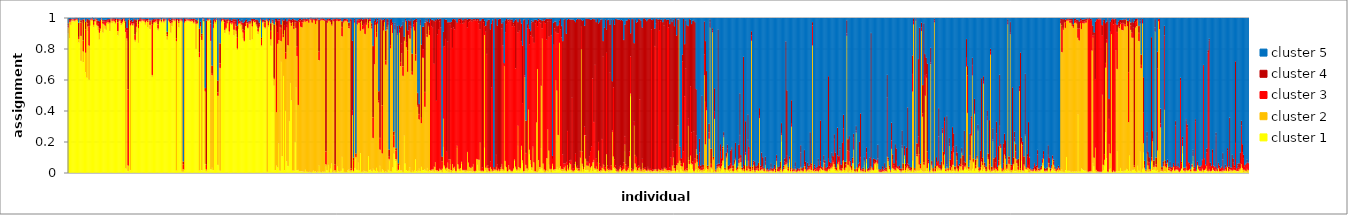
| Category | cluster 1 | cluster 2 | cluster 3 | cluster 4 | cluster 5 |
|---|---|---|---|---|---|
| 0 | 0.898 | 0.039 | 0.012 | 0.016 | 0.035 |
| 1 | 0.867 | 0.107 | 0.009 | 0.009 | 0.009 |
| 2 | 0.954 | 0.021 | 0.006 | 0.011 | 0.009 |
| 3 | 0.977 | 0.007 | 0.006 | 0.004 | 0.005 |
| 4 | 0.977 | 0.01 | 0.004 | 0.005 | 0.004 |
| 5 | 0.976 | 0.006 | 0.005 | 0.007 | 0.006 |
| 6 | 0.975 | 0.01 | 0.007 | 0.005 | 0.004 |
| 7 | 0.983 | 0.005 | 0.004 | 0.005 | 0.004 |
| 8 | 0.976 | 0.01 | 0.005 | 0.005 | 0.004 |
| 9 | 0.84 | 0.023 | 0.013 | 0.092 | 0.033 |
| 10 | 0.979 | 0.008 | 0.006 | 0.004 | 0.004 |
| 11 | 0.721 | 0.161 | 0.087 | 0.015 | 0.017 |
| 12 | 0.965 | 0.012 | 0.007 | 0.007 | 0.009 |
| 13 | 0.713 | 0.069 | 0.071 | 0.136 | 0.012 |
| 14 | 0.969 | 0.019 | 0.004 | 0.003 | 0.005 |
| 15 | 0.648 | 0.127 | 0.15 | 0.051 | 0.024 |
| 16 | 0.613 | 0.361 | 0.008 | 0.009 | 0.009 |
| 17 | 0.911 | 0.032 | 0.021 | 0.029 | 0.008 |
| 18 | 0.601 | 0.219 | 0.126 | 0.04 | 0.014 |
| 19 | 0.948 | 0.037 | 0.005 | 0.005 | 0.005 |
| 20 | 0.979 | 0.008 | 0.005 | 0.004 | 0.004 |
| 21 | 0.978 | 0.011 | 0.005 | 0.004 | 0.003 |
| 22 | 0.939 | 0.015 | 0.019 | 0.014 | 0.012 |
| 23 | 0.972 | 0.007 | 0.009 | 0.007 | 0.006 |
| 24 | 0.982 | 0.007 | 0.003 | 0.005 | 0.003 |
| 25 | 0.943 | 0.01 | 0.03 | 0.01 | 0.007 |
| 26 | 0.92 | 0.025 | 0.017 | 0.018 | 0.021 |
| 27 | 0.859 | 0.044 | 0.03 | 0.045 | 0.022 |
| 28 | 0.913 | 0.017 | 0.05 | 0.007 | 0.014 |
| 29 | 0.984 | 0.005 | 0.005 | 0.003 | 0.003 |
| 30 | 0.904 | 0.058 | 0.014 | 0.009 | 0.015 |
| 31 | 0.951 | 0.009 | 0.017 | 0.008 | 0.015 |
| 32 | 0.928 | 0.021 | 0.025 | 0.014 | 0.012 |
| 33 | 0.921 | 0.047 | 0.01 | 0.008 | 0.013 |
| 34 | 0.961 | 0.013 | 0.01 | 0.007 | 0.009 |
| 35 | 0.96 | 0.013 | 0.011 | 0.007 | 0.009 |
| 36 | 0.914 | 0.05 | 0.006 | 0.022 | 0.009 |
| 37 | 0.984 | 0.005 | 0.003 | 0.004 | 0.003 |
| 38 | 0.966 | 0.014 | 0.008 | 0.007 | 0.004 |
| 39 | 0.974 | 0.009 | 0.007 | 0.006 | 0.005 |
| 40 | 0.97 | 0.009 | 0.01 | 0.007 | 0.005 |
| 41 | 0.96 | 0.009 | 0.014 | 0.01 | 0.007 |
| 42 | 0.982 | 0.006 | 0.005 | 0.004 | 0.003 |
| 43 | 0.886 | 0.027 | 0.058 | 0.022 | 0.008 |
| 44 | 0.978 | 0.004 | 0.007 | 0.005 | 0.006 |
| 45 | 0.979 | 0.007 | 0.005 | 0.005 | 0.004 |
| 46 | 0.951 | 0.014 | 0.014 | 0.01 | 0.011 |
| 47 | 0.96 | 0.012 | 0.007 | 0.016 | 0.005 |
| 48 | 0.982 | 0.006 | 0.003 | 0.005 | 0.003 |
| 49 | 0.965 | 0.014 | 0.009 | 0.008 | 0.004 |
| 50 | 0.027 | 0.88 | 0.021 | 0.05 | 0.023 |
| 51 | 0.85 | 0.016 | 0.053 | 0.016 | 0.064 |
| 52 | 0.01 | 0.036 | 0.492 | 0.451 | 0.012 |
| 53 | 0.98 | 0.009 | 0.004 | 0.004 | 0.004 |
| 54 | 0.017 | 0.933 | 0.022 | 0.011 | 0.017 |
| 55 | 0.954 | 0.009 | 0.011 | 0.014 | 0.012 |
| 56 | 0.946 | 0.008 | 0.01 | 0.012 | 0.023 |
| 57 | 0.958 | 0.005 | 0.023 | 0.009 | 0.006 |
| 58 | 0.845 | 0.012 | 0.033 | 0.1 | 0.009 |
| 59 | 0.905 | 0.037 | 0.028 | 0.015 | 0.014 |
| 60 | 0.982 | 0.004 | 0.004 | 0.004 | 0.006 |
| 61 | 0.838 | 0.096 | 0.024 | 0.03 | 0.013 |
| 62 | 0.972 | 0.006 | 0.009 | 0.009 | 0.005 |
| 63 | 0.969 | 0.01 | 0.008 | 0.01 | 0.003 |
| 64 | 0.979 | 0.006 | 0.004 | 0.005 | 0.006 |
| 65 | 0.976 | 0.006 | 0.007 | 0.005 | 0.006 |
| 66 | 0.973 | 0.009 | 0.007 | 0.005 | 0.006 |
| 67 | 0.954 | 0.016 | 0.01 | 0.011 | 0.01 |
| 68 | 0.975 | 0.005 | 0.006 | 0.008 | 0.006 |
| 69 | 0.937 | 0.035 | 0.009 | 0.012 | 0.007 |
| 70 | 0.98 | 0.005 | 0.005 | 0.005 | 0.004 |
| 71 | 0.927 | 0.026 | 0.02 | 0.01 | 0.017 |
| 72 | 0.975 | 0.009 | 0.006 | 0.005 | 0.005 |
| 73 | 0.619 | 0.011 | 0.325 | 0.03 | 0.016 |
| 74 | 0.954 | 0.016 | 0.016 | 0.009 | 0.005 |
| 75 | 0.967 | 0.006 | 0.013 | 0.006 | 0.007 |
| 76 | 0.965 | 0.011 | 0.011 | 0.008 | 0.006 |
| 77 | 0.972 | 0.012 | 0.006 | 0.005 | 0.005 |
| 78 | 0.918 | 0.012 | 0.028 | 0.037 | 0.005 |
| 79 | 0.974 | 0.009 | 0.005 | 0.005 | 0.006 |
| 80 | 0.979 | 0.009 | 0.004 | 0.005 | 0.004 |
| 81 | 0.968 | 0.006 | 0.005 | 0.01 | 0.011 |
| 82 | 0.985 | 0.005 | 0.003 | 0.004 | 0.003 |
| 83 | 0.968 | 0.008 | 0.01 | 0.009 | 0.005 |
| 84 | 0.977 | 0.007 | 0.006 | 0.004 | 0.005 |
| 85 | 0.982 | 0.005 | 0.003 | 0.005 | 0.004 |
| 86 | 0.858 | 0.023 | 0.01 | 0.018 | 0.089 |
| 87 | 0.978 | 0.005 | 0.007 | 0.005 | 0.005 |
| 88 | 0.966 | 0.009 | 0.014 | 0.007 | 0.005 |
| 89 | 0.903 | 0.061 | 0.011 | 0.013 | 0.012 |
| 90 | 0.945 | 0.024 | 0.014 | 0.013 | 0.005 |
| 91 | 0.982 | 0.004 | 0.005 | 0.004 | 0.004 |
| 92 | 0.976 | 0.007 | 0.006 | 0.005 | 0.005 |
| 93 | 0.979 | 0.007 | 0.004 | 0.005 | 0.004 |
| 94 | 0.014 | 0.835 | 0.018 | 0.128 | 0.006 |
| 95 | 0.981 | 0.004 | 0.006 | 0.004 | 0.005 |
| 96 | 0.937 | 0.03 | 0.009 | 0.016 | 0.008 |
| 97 | 0.976 | 0.007 | 0.006 | 0.006 | 0.006 |
| 98 | 0.981 | 0.005 | 0.005 | 0.005 | 0.004 |
| 99 | 0.007 | 0.969 | 0.009 | 0.01 | 0.004 |
| 100 | 0.007 | 0.015 | 0.031 | 0.02 | 0.927 |
| 101 | 0.019 | 0.95 | 0.009 | 0.018 | 0.005 |
| 102 | 0.973 | 0.005 | 0.011 | 0.006 | 0.005 |
| 103 | 0.98 | 0.006 | 0.005 | 0.005 | 0.004 |
| 104 | 0.976 | 0.007 | 0.005 | 0.006 | 0.005 |
| 105 | 0.977 | 0.006 | 0.005 | 0.006 | 0.007 |
| 106 | 0.972 | 0.008 | 0.009 | 0.006 | 0.005 |
| 107 | 0.971 | 0.01 | 0.005 | 0.008 | 0.006 |
| 108 | 0.975 | 0.006 | 0.01 | 0.004 | 0.004 |
| 109 | 0.961 | 0.008 | 0.011 | 0.013 | 0.007 |
| 110 | 0.974 | 0.009 | 0.008 | 0.005 | 0.005 |
| 111 | 0.8 | 0.161 | 0.011 | 0.016 | 0.012 |
| 112 | 0.956 | 0.008 | 0.011 | 0.008 | 0.016 |
| 113 | 0.985 | 0.004 | 0.003 | 0.003 | 0.004 |
| 114 | 0.015 | 0.73 | 0.031 | 0.154 | 0.07 |
| 115 | 0.875 | 0.07 | 0.015 | 0.015 | 0.026 |
| 116 | 0.016 | 0.84 | 0.028 | 0.013 | 0.103 |
| 117 | 0.987 | 0.004 | 0.004 | 0.003 | 0.003 |
| 118 | 0.97 | 0.008 | 0.012 | 0.006 | 0.004 |
| 119 | 0.056 | 0.468 | 0.01 | 0.012 | 0.454 |
| 120 | 0.008 | 0.013 | 0.031 | 0.929 | 0.019 |
| 121 | 0.977 | 0.007 | 0.006 | 0.006 | 0.004 |
| 122 | 0.977 | 0.007 | 0.005 | 0.004 | 0.007 |
| 123 | 0.983 | 0.004 | 0.004 | 0.004 | 0.005 |
| 124 | 0.022 | 0.828 | 0.113 | 0.023 | 0.014 |
| 125 | 0.032 | 0.597 | 0.009 | 0.052 | 0.31 |
| 126 | 0.017 | 0.917 | 0.021 | 0.035 | 0.01 |
| 127 | 0.967 | 0.014 | 0.006 | 0.009 | 0.005 |
| 128 | 0.959 | 0.014 | 0.009 | 0.007 | 0.011 |
| 129 | 0.982 | 0.005 | 0.006 | 0.004 | 0.003 |
| 130 | 0.05 | 0.446 | 0.021 | 0.078 | 0.404 |
| 131 | 0.588 | 0.394 | 0.009 | 0.005 | 0.005 |
| 132 | 0.013 | 0.663 | 0.03 | 0.129 | 0.165 |
| 133 | 0.969 | 0.009 | 0.008 | 0.009 | 0.005 |
| 134 | 0.982 | 0.003 | 0.004 | 0.005 | 0.005 |
| 135 | 0.971 | 0.012 | 0.006 | 0.007 | 0.004 |
| 136 | 0.901 | 0.02 | 0.048 | 0.022 | 0.01 |
| 137 | 0.925 | 0.009 | 0.049 | 0.007 | 0.01 |
| 138 | 0.957 | 0.009 | 0.012 | 0.013 | 0.009 |
| 139 | 0.977 | 0.006 | 0.008 | 0.005 | 0.005 |
| 140 | 0.89 | 0.021 | 0.064 | 0.01 | 0.015 |
| 141 | 0.96 | 0.008 | 0.012 | 0.011 | 0.009 |
| 142 | 0.952 | 0.01 | 0.008 | 0.012 | 0.018 |
| 143 | 0.955 | 0.012 | 0.018 | 0.008 | 0.007 |
| 144 | 0.886 | 0.036 | 0.056 | 0.013 | 0.009 |
| 145 | 0.953 | 0.008 | 0.016 | 0.014 | 0.009 |
| 146 | 0.894 | 0.022 | 0.029 | 0.046 | 0.01 |
| 147 | 0.793 | 0.009 | 0.069 | 0.077 | 0.052 |
| 148 | 0.926 | 0.036 | 0.016 | 0.016 | 0.006 |
| 149 | 0.956 | 0.009 | 0.008 | 0.008 | 0.018 |
| 150 | 0.943 | 0.02 | 0.007 | 0.007 | 0.023 |
| 151 | 0.917 | 0.037 | 0.016 | 0.019 | 0.011 |
| 152 | 0.866 | 0.038 | 0.021 | 0.042 | 0.033 |
| 153 | 0.843 | 0.008 | 0.066 | 0.059 | 0.025 |
| 154 | 0.942 | 0.004 | 0.02 | 0.019 | 0.015 |
| 155 | 0.947 | 0.02 | 0.01 | 0.013 | 0.01 |
| 156 | 0.928 | 0.007 | 0.029 | 0.009 | 0.026 |
| 157 | 0.956 | 0.006 | 0.008 | 0.01 | 0.021 |
| 158 | 0.855 | 0.108 | 0.009 | 0.008 | 0.019 |
| 159 | 0.974 | 0.006 | 0.005 | 0.009 | 0.006 |
| 160 | 0.86 | 0.084 | 0.016 | 0.033 | 0.006 |
| 161 | 0.973 | 0.006 | 0.007 | 0.007 | 0.008 |
| 162 | 0.965 | 0.007 | 0.011 | 0.01 | 0.007 |
| 163 | 0.954 | 0.018 | 0.007 | 0.008 | 0.014 |
| 164 | 0.94 | 0.009 | 0.007 | 0.035 | 0.009 |
| 165 | 0.894 | 0.017 | 0.018 | 0.055 | 0.016 |
| 166 | 0.934 | 0.009 | 0.012 | 0.013 | 0.032 |
| 167 | 0.979 | 0.007 | 0.004 | 0.006 | 0.004 |
| 168 | 0.814 | 0.008 | 0.04 | 0.011 | 0.127 |
| 169 | 0.964 | 0.008 | 0.007 | 0.012 | 0.009 |
| 170 | 0.941 | 0.03 | 0.005 | 0.01 | 0.014 |
| 171 | 0.929 | 0.008 | 0.031 | 0.016 | 0.016 |
| 172 | 0.981 | 0.004 | 0.005 | 0.004 | 0.006 |
| 173 | 0.006 | 0.972 | 0.007 | 0.006 | 0.008 |
| 174 | 0.938 | 0.013 | 0.016 | 0.012 | 0.021 |
| 175 | 0.969 | 0.011 | 0.005 | 0.008 | 0.007 |
| 176 | 0.819 | 0.041 | 0.055 | 0.05 | 0.035 |
| 177 | 0.97 | 0.005 | 0.006 | 0.01 | 0.009 |
| 178 | 0.949 | 0.015 | 0.01 | 0.012 | 0.014 |
| 179 | 0.561 | 0.043 | 0.007 | 0.346 | 0.042 |
| 180 | 0.016 | 0.958 | 0.008 | 0.011 | 0.007 |
| 181 | 0.046 | 0.345 | 0.556 | 0.046 | 0.007 |
| 182 | 0.034 | 0.798 | 0.071 | 0.081 | 0.015 |
| 183 | 0.188 | 0.667 | 0.129 | 0.009 | 0.007 |
| 184 | 0.013 | 0.926 | 0.044 | 0.011 | 0.007 |
| 185 | 0.715 | 0.134 | 0.085 | 0.023 | 0.043 |
| 186 | 0.106 | 0.872 | 0.007 | 0.007 | 0.007 |
| 187 | 0.624 | 0.25 | 0.017 | 0.092 | 0.017 |
| 188 | 0.016 | 0.904 | 0.033 | 0.031 | 0.016 |
| 189 | 0.399 | 0.335 | 0.043 | 0.216 | 0.008 |
| 190 | 0.073 | 0.864 | 0.017 | 0.024 | 0.022 |
| 191 | 0.043 | 0.779 | 0.159 | 0.01 | 0.008 |
| 192 | 0.333 | 0.645 | 0.013 | 0.006 | 0.004 |
| 193 | 0.579 | 0.389 | 0.011 | 0.011 | 0.01 |
| 194 | 0.467 | 0.481 | 0.016 | 0.023 | 0.013 |
| 195 | 0.014 | 0.957 | 0.012 | 0.011 | 0.006 |
| 196 | 0.013 | 0.915 | 0.014 | 0.049 | 0.008 |
| 197 | 0.199 | 0.77 | 0.011 | 0.007 | 0.013 |
| 198 | 0.55 | 0.383 | 0.035 | 0.016 | 0.015 |
| 199 | 0.016 | 0.736 | 0.061 | 0.167 | 0.021 |
| 200 | 0.018 | 0.419 | 0.538 | 0.013 | 0.012 |
| 201 | 0.009 | 0.963 | 0.01 | 0.013 | 0.005 |
| 202 | 0.01 | 0.932 | 0.041 | 0.012 | 0.005 |
| 203 | 0.009 | 0.929 | 0.034 | 0.016 | 0.012 |
| 204 | 0.008 | 0.963 | 0.009 | 0.015 | 0.006 |
| 205 | 0.006 | 0.976 | 0.006 | 0.007 | 0.004 |
| 206 | 0.02 | 0.955 | 0.007 | 0.01 | 0.008 |
| 207 | 0.007 | 0.97 | 0.01 | 0.007 | 0.004 |
| 208 | 0.007 | 0.974 | 0.007 | 0.007 | 0.005 |
| 209 | 0.005 | 0.963 | 0.012 | 0.011 | 0.009 |
| 210 | 0.006 | 0.98 | 0.004 | 0.006 | 0.004 |
| 211 | 0.004 | 0.982 | 0.007 | 0.005 | 0.003 |
| 212 | 0.006 | 0.962 | 0.019 | 0.008 | 0.005 |
| 213 | 0.014 | 0.971 | 0.005 | 0.006 | 0.004 |
| 214 | 0.007 | 0.976 | 0.005 | 0.006 | 0.006 |
| 215 | 0.009 | 0.95 | 0.027 | 0.01 | 0.004 |
| 216 | 0.004 | 0.975 | 0.007 | 0.009 | 0.004 |
| 217 | 0.007 | 0.978 | 0.005 | 0.007 | 0.004 |
| 218 | 0.046 | 0.68 | 0.055 | 0.207 | 0.011 |
| 219 | 0.006 | 0.976 | 0.007 | 0.006 | 0.004 |
| 220 | 0.004 | 0.98 | 0.005 | 0.006 | 0.005 |
| 221 | 0.008 | 0.977 | 0.007 | 0.005 | 0.003 |
| 222 | 0.006 | 0.975 | 0.004 | 0.009 | 0.006 |
| 223 | 0.006 | 0.974 | 0.008 | 0.006 | 0.006 |
| 224 | 0.038 | 0.016 | 0.084 | 0.847 | 0.016 |
| 225 | 0.015 | 0.953 | 0.013 | 0.013 | 0.006 |
| 226 | 0.05 | 0.931 | 0.008 | 0.005 | 0.007 |
| 227 | 0.004 | 0.974 | 0.005 | 0.012 | 0.004 |
| 228 | 0.027 | 0.947 | 0.007 | 0.011 | 0.008 |
| 229 | 0.059 | 0.891 | 0.008 | 0.029 | 0.014 |
| 230 | 0.004 | 0.978 | 0.005 | 0.009 | 0.004 |
| 231 | 0.009 | 0.967 | 0.011 | 0.006 | 0.007 |
| 232 | 0.005 | 0.011 | 0.036 | 0.941 | 0.007 |
| 233 | 0.005 | 0.976 | 0.009 | 0.006 | 0.004 |
| 234 | 0.041 | 0.941 | 0.007 | 0.006 | 0.005 |
| 235 | 0.009 | 0.969 | 0.009 | 0.007 | 0.007 |
| 236 | 0.006 | 0.972 | 0.008 | 0.008 | 0.006 |
| 237 | 0.011 | 0.969 | 0.005 | 0.009 | 0.005 |
| 238 | 0.102 | 0.778 | 0.06 | 0.037 | 0.023 |
| 239 | 0.026 | 0.944 | 0.008 | 0.013 | 0.01 |
| 240 | 0.005 | 0.972 | 0.005 | 0.013 | 0.005 |
| 241 | 0.005 | 0.975 | 0.006 | 0.008 | 0.006 |
| 242 | 0.004 | 0.977 | 0.007 | 0.007 | 0.005 |
| 243 | 0.014 | 0.959 | 0.015 | 0.005 | 0.008 |
| 244 | 0.021 | 0.911 | 0.014 | 0.022 | 0.031 |
| 245 | 0.007 | 0.971 | 0.009 | 0.007 | 0.006 |
| 246 | 0.007 | 0.009 | 0.011 | 0.964 | 0.009 |
| 247 | 0.019 | 0.352 | 0.032 | 0.449 | 0.148 |
| 248 | 0.006 | 0.007 | 0.065 | 0.02 | 0.902 |
| 249 | 0.03 | 0.938 | 0.017 | 0.009 | 0.007 |
| 250 | 0.089 | 0.013 | 0.013 | 0.009 | 0.877 |
| 251 | 0.018 | 0.939 | 0.024 | 0.009 | 0.01 |
| 252 | 0.065 | 0.903 | 0.014 | 0.009 | 0.008 |
| 253 | 0.014 | 0.953 | 0.018 | 0.008 | 0.007 |
| 254 | 0.126 | 0.79 | 0.053 | 0.022 | 0.01 |
| 255 | 0.006 | 0.973 | 0.007 | 0.01 | 0.004 |
| 256 | 0.006 | 0.919 | 0.025 | 0.039 | 0.011 |
| 257 | 0.013 | 0.916 | 0.031 | 0.033 | 0.007 |
| 258 | 0.008 | 0.887 | 0.092 | 0.009 | 0.004 |
| 259 | 0.008 | 0.947 | 0.012 | 0.028 | 0.005 |
| 260 | 0.006 | 0.982 | 0.004 | 0.004 | 0.004 |
| 261 | 0.106 | 0.827 | 0.032 | 0.025 | 0.011 |
| 262 | 0.017 | 0.96 | 0.014 | 0.005 | 0.004 |
| 263 | 0.019 | 0.959 | 0.012 | 0.006 | 0.004 |
| 264 | 0.008 | 0.922 | 0.016 | 0.018 | 0.036 |
| 265 | 0.026 | 0.198 | 0.134 | 0.46 | 0.183 |
| 266 | 0.017 | 0.683 | 0.248 | 0.032 | 0.019 |
| 267 | 0.009 | 0.946 | 0.014 | 0.024 | 0.006 |
| 268 | 0.032 | 0.844 | 0.03 | 0.067 | 0.028 |
| 269 | 0.011 | 0.95 | 0.022 | 0.012 | 0.005 |
| 270 | 0.005 | 0.448 | 0.012 | 0.061 | 0.473 |
| 271 | 0.044 | 0.105 | 0.075 | 0.767 | 0.01 |
| 272 | 0.006 | 0.978 | 0.005 | 0.007 | 0.004 |
| 273 | 0.022 | 0.103 | 0.31 | 0.55 | 0.014 |
| 274 | 0.014 | 0.904 | 0.023 | 0.048 | 0.011 |
| 275 | 0.005 | 0.968 | 0.008 | 0.012 | 0.006 |
| 276 | 0.008 | 0.689 | 0.028 | 0.193 | 0.082 |
| 277 | 0.005 | 0.92 | 0.014 | 0.054 | 0.008 |
| 278 | 0.018 | 0.936 | 0.016 | 0.021 | 0.008 |
| 279 | 0.078 | 0.011 | 0.014 | 0.046 | 0.852 |
| 280 | 0.009 | 0.794 | 0.02 | 0.168 | 0.009 |
| 281 | 0.008 | 0.945 | 0.012 | 0.027 | 0.007 |
| 282 | 0.034 | 0.867 | 0.054 | 0.016 | 0.029 |
| 283 | 0.122 | 0.041 | 0.08 | 0.023 | 0.735 |
| 284 | 0.255 | 0.668 | 0.033 | 0.011 | 0.034 |
| 285 | 0.074 | 0.013 | 0.058 | 0.014 | 0.84 |
| 286 | 0.009 | 0.881 | 0.009 | 0.05 | 0.051 |
| 287 | 0.014 | 0.005 | 0.031 | 0.011 | 0.939 |
| 288 | 0.048 | 0.856 | 0.022 | 0.026 | 0.048 |
| 289 | 0.014 | 0.673 | 0.027 | 0.225 | 0.06 |
| 290 | 0.014 | 0.757 | 0.065 | 0.113 | 0.051 |
| 291 | 0.005 | 0.62 | 0.062 | 0.287 | 0.027 |
| 292 | 0.24 | 0.612 | 0.011 | 0.014 | 0.123 |
| 293 | 0.059 | 0.916 | 0.009 | 0.01 | 0.006 |
| 294 | 0.016 | 0.794 | 0.033 | 0.138 | 0.018 |
| 295 | 0.01 | 0.641 | 0.138 | 0.131 | 0.08 |
| 296 | 0.012 | 0.876 | 0.029 | 0.067 | 0.016 |
| 297 | 0.035 | 0.83 | 0.084 | 0.03 | 0.021 |
| 298 | 0.005 | 0.926 | 0.015 | 0.048 | 0.006 |
| 299 | 0.014 | 0.619 | 0.018 | 0.117 | 0.232 |
| 300 | 0.006 | 0.936 | 0.016 | 0.025 | 0.017 |
| 301 | 0.014 | 0.903 | 0.05 | 0.02 | 0.013 |
| 302 | 0.086 | 0.636 | 0.042 | 0.228 | 0.009 |
| 303 | 0.008 | 0.963 | 0.01 | 0.013 | 0.006 |
| 304 | 0.013 | 0.413 | 0.01 | 0.079 | 0.486 |
| 305 | 0.026 | 0.318 | 0.034 | 0.066 | 0.555 |
| 306 | 0.009 | 0.943 | 0.014 | 0.024 | 0.01 |
| 307 | 0.038 | 0.281 | 0.035 | 0.473 | 0.174 |
| 308 | 0.017 | 0.726 | 0.055 | 0.144 | 0.058 |
| 309 | 0.016 | 0.725 | 0.055 | 0.146 | 0.057 |
| 310 | 0.022 | 0.403 | 0.096 | 0.447 | 0.033 |
| 311 | 0.013 | 0.956 | 0.013 | 0.011 | 0.008 |
| 312 | 0.03 | 0.846 | 0.015 | 0.084 | 0.024 |
| 313 | 0.008 | 0.936 | 0.009 | 0.04 | 0.007 |
| 314 | 0.016 | 0.872 | 0.028 | 0.054 | 0.029 |
| 315 | 0.009 | 0.009 | 0.961 | 0.016 | 0.005 |
| 316 | 0.009 | 0.011 | 0.926 | 0.04 | 0.014 |
| 317 | 0.013 | 0.01 | 0.912 | 0.052 | 0.014 |
| 318 | 0.007 | 0.032 | 0.664 | 0.277 | 0.02 |
| 319 | 0.035 | 0.033 | 0.909 | 0.015 | 0.007 |
| 320 | 0.008 | 0.008 | 0.448 | 0.521 | 0.015 |
| 321 | 0.008 | 0.009 | 0.875 | 0.102 | 0.005 |
| 322 | 0.006 | 0.005 | 0.911 | 0.067 | 0.01 |
| 323 | 0.019 | 0.007 | 0.952 | 0.016 | 0.006 |
| 324 | 0.012 | 0.007 | 0.918 | 0.057 | 0.006 |
| 325 | 0.005 | 0.021 | 0.048 | 0.029 | 0.897 |
| 326 | 0.166 | 0.183 | 0.463 | 0.098 | 0.09 |
| 327 | 0.034 | 0.012 | 0.771 | 0.175 | 0.008 |
| 328 | 0.015 | 0.012 | 0.836 | 0.125 | 0.013 |
| 329 | 0.008 | 0.024 | 0.103 | 0.854 | 0.012 |
| 330 | 0.031 | 0.034 | 0.78 | 0.126 | 0.029 |
| 331 | 0.005 | 0.018 | 0.063 | 0.886 | 0.028 |
| 332 | 0.054 | 0.033 | 0.868 | 0.016 | 0.028 |
| 333 | 0.004 | 0.012 | 0.915 | 0.043 | 0.025 |
| 334 | 0.009 | 0.046 | 0.75 | 0.185 | 0.01 |
| 335 | 0.015 | 0.017 | 0.905 | 0.056 | 0.007 |
| 336 | 0.023 | 0.015 | 0.885 | 0.067 | 0.01 |
| 337 | 0.004 | 0.007 | 0.972 | 0.008 | 0.008 |
| 338 | 0.158 | 0.017 | 0.786 | 0.009 | 0.03 |
| 339 | 0.024 | 0.029 | 0.935 | 0.007 | 0.005 |
| 340 | 0.011 | 0.014 | 0.958 | 0.012 | 0.006 |
| 341 | 0.011 | 0.019 | 0.931 | 0.031 | 0.008 |
| 342 | 0.055 | 0.016 | 0.917 | 0.008 | 0.005 |
| 343 | 0.011 | 0.007 | 0.944 | 0.022 | 0.015 |
| 344 | 0.011 | 0.006 | 0.95 | 0.025 | 0.008 |
| 345 | 0.006 | 0.012 | 0.963 | 0.012 | 0.007 |
| 346 | 0.008 | 0.01 | 0.968 | 0.01 | 0.005 |
| 347 | 0.01 | 0.124 | 0.803 | 0.051 | 0.013 |
| 348 | 0.011 | 0.055 | 0.906 | 0.021 | 0.007 |
| 349 | 0.01 | 0.027 | 0.941 | 0.016 | 0.007 |
| 350 | 0.008 | 0.023 | 0.954 | 0.008 | 0.007 |
| 351 | 0.007 | 0.031 | 0.937 | 0.014 | 0.011 |
| 352 | 0.013 | 0.043 | 0.928 | 0.01 | 0.006 |
| 353 | 0.004 | 0.006 | 0.975 | 0.009 | 0.006 |
| 354 | 0.007 | 0.006 | 0.97 | 0.007 | 0.009 |
| 355 | 0.009 | 0.08 | 0.891 | 0.015 | 0.005 |
| 356 | 0.05 | 0.036 | 0.898 | 0.008 | 0.008 |
| 357 | 0.012 | 0.072 | 0.88 | 0.031 | 0.005 |
| 358 | 0.01 | 0.186 | 0.728 | 0.056 | 0.021 |
| 359 | 0.006 | 0.007 | 0.971 | 0.006 | 0.009 |
| 360 | 0.007 | 0.007 | 0.02 | 0.96 | 0.006 |
| 361 | 0.006 | 0.006 | 0.959 | 0.023 | 0.007 |
| 362 | 0.161 | 0.727 | 0.056 | 0.037 | 0.019 |
| 363 | 0.014 | 0.018 | 0.877 | 0.04 | 0.051 |
| 364 | 0.004 | 0.04 | 0.722 | 0.212 | 0.022 |
| 365 | 0.015 | 0.013 | 0.019 | 0.942 | 0.011 |
| 366 | 0.004 | 0.007 | 0.019 | 0.958 | 0.012 |
| 367 | 0.007 | 0.03 | 0.036 | 0.853 | 0.074 |
| 368 | 0.008 | 0.016 | 0.526 | 0.413 | 0.037 |
| 369 | 0.006 | 0.007 | 0.969 | 0.006 | 0.012 |
| 370 | 0.009 | 0.014 | 0.004 | 0.008 | 0.966 |
| 371 | 0.009 | 0.008 | 0.006 | 0.973 | 0.004 |
| 372 | 0.019 | 0.019 | 0.077 | 0.877 | 0.008 |
| 373 | 0.007 | 0.007 | 0.038 | 0.898 | 0.05 |
| 374 | 0.011 | 0.011 | 0.008 | 0.96 | 0.01 |
| 375 | 0.007 | 0.007 | 0.009 | 0.97 | 0.008 |
| 376 | 0.011 | 0.014 | 0.009 | 0.96 | 0.005 |
| 377 | 0.043 | 0.013 | 0.874 | 0.033 | 0.037 |
| 378 | 0.008 | 0.013 | 0.8 | 0.156 | 0.023 |
| 379 | 0.011 | 0.676 | 0.009 | 0.011 | 0.293 |
| 380 | 0.04 | 0.036 | 0.828 | 0.08 | 0.016 |
| 381 | 0.012 | 0.023 | 0.924 | 0.036 | 0.006 |
| 382 | 0.004 | 0.006 | 0.971 | 0.008 | 0.011 |
| 383 | 0.015 | 0.033 | 0.928 | 0.013 | 0.01 |
| 384 | 0.016 | 0.005 | 0.96 | 0.011 | 0.008 |
| 385 | 0.005 | 0.007 | 0.966 | 0.009 | 0.013 |
| 386 | 0.006 | 0.006 | 0.932 | 0.046 | 0.009 |
| 387 | 0.017 | 0.01 | 0.929 | 0.014 | 0.03 |
| 388 | 0.074 | 0.012 | 0.858 | 0.035 | 0.02 |
| 389 | 0.026 | 0.013 | 0.635 | 0.315 | 0.011 |
| 390 | 0.009 | 0.011 | 0.96 | 0.011 | 0.009 |
| 391 | 0.173 | 0.131 | 0.602 | 0.066 | 0.027 |
| 392 | 0.012 | 0.023 | 0.881 | 0.076 | 0.008 |
| 393 | 0.02 | 0.009 | 0.954 | 0.008 | 0.01 |
| 394 | 0.146 | 0.028 | 0.672 | 0.117 | 0.037 |
| 395 | 0.06 | 0.02 | 0.369 | 0.372 | 0.179 |
| 396 | 0.004 | 0.006 | 0.971 | 0.006 | 0.013 |
| 397 | 0.009 | 0.608 | 0.011 | 0.363 | 0.01 |
| 398 | 0.022 | 0.028 | 0.077 | 0.209 | 0.664 |
| 399 | 0.008 | 0.02 | 0.904 | 0.028 | 0.041 |
| 400 | 0.015 | 0.393 | 0.54 | 0.042 | 0.01 |
| 401 | 0.118 | 0.031 | 0.678 | 0.102 | 0.072 |
| 402 | 0.053 | 0.028 | 0.805 | 0.028 | 0.086 |
| 403 | 0.015 | 0.019 | 0.935 | 0.014 | 0.017 |
| 404 | 0.154 | 0.015 | 0.706 | 0.099 | 0.027 |
| 405 | 0.006 | 0.06 | 0.772 | 0.148 | 0.014 |
| 406 | 0.005 | 0.005 | 0.955 | 0.023 | 0.012 |
| 407 | 0.005 | 0.32 | 0.654 | 0.008 | 0.012 |
| 408 | 0.005 | 0.664 | 0.276 | 0.035 | 0.02 |
| 409 | 0.012 | 0.069 | 0.903 | 0.009 | 0.007 |
| 410 | 0.022 | 0.013 | 0.935 | 0.019 | 0.01 |
| 411 | 0.157 | 0.404 | 0.404 | 0.022 | 0.013 |
| 412 | 0.027 | 0.839 | 0.066 | 0.048 | 0.02 |
| 413 | 0.013 | 0.046 | 0.923 | 0.01 | 0.008 |
| 414 | 0.003 | 0.018 | 0.946 | 0.015 | 0.018 |
| 415 | 0.004 | 0.01 | 0.948 | 0.029 | 0.009 |
| 416 | 0.013 | 0.08 | 0.765 | 0.135 | 0.006 |
| 417 | 0.007 | 0.272 | 0.698 | 0.016 | 0.006 |
| 418 | 0.051 | 0.091 | 0.736 | 0.115 | 0.007 |
| 419 | 0.014 | 0.01 | 0.954 | 0.014 | 0.008 |
| 420 | 0.004 | 0.021 | 0.863 | 0.105 | 0.007 |
| 421 | 0.043 | 0.015 | 0.031 | 0.02 | 0.89 |
| 422 | 0.014 | 0.007 | 0.804 | 0.143 | 0.032 |
| 423 | 0.012 | 0.01 | 0.91 | 0.045 | 0.023 |
| 424 | 0.023 | 0.575 | 0.31 | 0.066 | 0.026 |
| 425 | 0.036 | 0.494 | 0.371 | 0.046 | 0.053 |
| 426 | 0.019 | 0.224 | 0.657 | 0.052 | 0.047 |
| 427 | 0.029 | 0.81 | 0.127 | 0.018 | 0.015 |
| 428 | 0.018 | 0.024 | 0.884 | 0.066 | 0.008 |
| 429 | 0.01 | 0.015 | 0.847 | 0.075 | 0.053 |
| 430 | 0.007 | 0.016 | 0.094 | 0.733 | 0.15 |
| 431 | 0.009 | 0.025 | 0.026 | 0.928 | 0.012 |
| 432 | 0.017 | 0.027 | 0.016 | 0.935 | 0.005 |
| 433 | 0.006 | 0.006 | 0.057 | 0.828 | 0.103 |
| 434 | 0.024 | 0.026 | 0.219 | 0.718 | 0.013 |
| 435 | 0.01 | 0.01 | 0.01 | 0.963 | 0.007 |
| 436 | 0.036 | 0.027 | 0.015 | 0.912 | 0.01 |
| 437 | 0.014 | 0.04 | 0.028 | 0.907 | 0.011 |
| 438 | 0.005 | 0.013 | 0.466 | 0.505 | 0.011 |
| 439 | 0.005 | 0.007 | 0.016 | 0.961 | 0.01 |
| 440 | 0.007 | 0.009 | 0.036 | 0.931 | 0.017 |
| 441 | 0.053 | 0.018 | 0.052 | 0.849 | 0.028 |
| 442 | 0.015 | 0.017 | 0.006 | 0.949 | 0.013 |
| 443 | 0.01 | 0.018 | 0.016 | 0.95 | 0.006 |
| 444 | 0.007 | 0.007 | 0.014 | 0.962 | 0.01 |
| 445 | 0.025 | 0.072 | 0.043 | 0.853 | 0.008 |
| 446 | 0.007 | 0.79 | 0.144 | 0.046 | 0.013 |
| 447 | 0.04 | 0.018 | 0.079 | 0.843 | 0.02 |
| 448 | 0.007 | 0.016 | 0.014 | 0.949 | 0.014 |
| 449 | 0.034 | 0.208 | 0.055 | 0.651 | 0.051 |
| 450 | 0.016 | 0.074 | 0.151 | 0.754 | 0.006 |
| 451 | 0.018 | 0.028 | 0.024 | 0.924 | 0.006 |
| 452 | 0.017 | 0.028 | 0.025 | 0.923 | 0.007 |
| 453 | 0.006 | 0.054 | 0.047 | 0.885 | 0.008 |
| 454 | 0.014 | 0.02 | 0.105 | 0.85 | 0.011 |
| 455 | 0.037 | 0.006 | 0.127 | 0.818 | 0.011 |
| 456 | 0.008 | 0.058 | 0.543 | 0.385 | 0.007 |
| 457 | 0.067 | 0.015 | 0.245 | 0.664 | 0.008 |
| 458 | 0.017 | 0.01 | 0.669 | 0.295 | 0.009 |
| 459 | 0.017 | 0.024 | 0.051 | 0.88 | 0.028 |
| 460 | 0.006 | 0.018 | 0.04 | 0.928 | 0.008 |
| 461 | 0.013 | 0.13 | 0.055 | 0.766 | 0.035 |
| 462 | 0.006 | 0.005 | 0.048 | 0.913 | 0.028 |
| 463 | 0.005 | 0.011 | 0.022 | 0.95 | 0.012 |
| 464 | 0.009 | 0.021 | 0.187 | 0.774 | 0.008 |
| 465 | 0.039 | 0.017 | 0.696 | 0.098 | 0.149 |
| 466 | 0.011 | 0.01 | 0.026 | 0.89 | 0.063 |
| 467 | 0.006 | 0.006 | 0.024 | 0.954 | 0.01 |
| 468 | 0.011 | 0.108 | 0.655 | 0.151 | 0.074 |
| 469 | 0.011 | 0.013 | 0.023 | 0.938 | 0.016 |
| 470 | 0.005 | 0.012 | 0.009 | 0.962 | 0.012 |
| 471 | 0.008 | 0.013 | 0.624 | 0.311 | 0.044 |
| 472 | 0.009 | 0.008 | 0.031 | 0.94 | 0.012 |
| 473 | 0.014 | 0.25 | 0.01 | 0.317 | 0.409 |
| 474 | 0.029 | 0.076 | 0.446 | 0.435 | 0.013 |
| 475 | 0.024 | 0.012 | 0.051 | 0.868 | 0.045 |
| 476 | 0.01 | 0.018 | 0.019 | 0.946 | 0.007 |
| 477 | 0.004 | 0.008 | 0.009 | 0.97 | 0.01 |
| 478 | 0.003 | 0.006 | 0.005 | 0.974 | 0.012 |
| 479 | 0.006 | 0.019 | 0.013 | 0.95 | 0.012 |
| 480 | 0.022 | 0.013 | 0.013 | 0.936 | 0.016 |
| 481 | 0.006 | 0.007 | 0.014 | 0.961 | 0.012 |
| 482 | 0.006 | 0.012 | 0.025 | 0.937 | 0.019 |
| 483 | 0.006 | 0.018 | 0.043 | 0.79 | 0.143 |
| 484 | 0.135 | 0.047 | 0.054 | 0.72 | 0.044 |
| 485 | 0.006 | 0.006 | 0.041 | 0.928 | 0.019 |
| 486 | 0.007 | 0.012 | 0.018 | 0.947 | 0.016 |
| 487 | 0.014 | 0.017 | 0.008 | 0.953 | 0.007 |
| 488 | 0.006 | 0.1 | 0.031 | 0.853 | 0.011 |
| 489 | 0.491 | 0.02 | 0.239 | 0.15 | 0.1 |
| 490 | 0.004 | 0.008 | 0.015 | 0.965 | 0.008 |
| 491 | 0.004 | 0.01 | 0.007 | 0.971 | 0.008 |
| 492 | 0.026 | 0.278 | 0.025 | 0.507 | 0.164 |
| 493 | 0.018 | 0.041 | 0.055 | 0.877 | 0.008 |
| 494 | 0.008 | 0.027 | 0.067 | 0.868 | 0.031 |
| 495 | 0.008 | 0.008 | 0.027 | 0.932 | 0.025 |
| 496 | 0.008 | 0.022 | 0.015 | 0.947 | 0.009 |
| 497 | 0.006 | 0.03 | 0.438 | 0.516 | 0.009 |
| 498 | 0.006 | 0.008 | 0.007 | 0.961 | 0.017 |
| 499 | 0.006 | 0.057 | 0.027 | 0.847 | 0.063 |
| 500 | 0.006 | 0.014 | 0.008 | 0.967 | 0.005 |
| 501 | 0.006 | 0.018 | 0.008 | 0.964 | 0.004 |
| 502 | 0.009 | 0.011 | 0.012 | 0.958 | 0.01 |
| 503 | 0.006 | 0.004 | 0.006 | 0.963 | 0.022 |
| 504 | 0.011 | 0.014 | 0.012 | 0.953 | 0.01 |
| 505 | 0.008 | 0.007 | 0.009 | 0.969 | 0.008 |
| 506 | 0.004 | 0.012 | 0.009 | 0.971 | 0.005 |
| 507 | 0.007 | 0.008 | 0.91 | 0.062 | 0.013 |
| 508 | 0.005 | 0.006 | 0.011 | 0.963 | 0.015 |
| 509 | 0.008 | 0.006 | 0.006 | 0.972 | 0.008 |
| 510 | 0.008 | 0.013 | 0.796 | 0.113 | 0.071 |
| 511 | 0.006 | 0.017 | 0.938 | 0.034 | 0.005 |
| 512 | 0.005 | 0.005 | 0.008 | 0.973 | 0.01 |
| 513 | 0.009 | 0.016 | 0.949 | 0.015 | 0.01 |
| 514 | 0.005 | 0.015 | 0.896 | 0.075 | 0.008 |
| 515 | 0.006 | 0.01 | 0.961 | 0.009 | 0.014 |
| 516 | 0.008 | 0.011 | 0.006 | 0.965 | 0.01 |
| 517 | 0.008 | 0.006 | 0.007 | 0.951 | 0.028 |
| 518 | 0.009 | 0.022 | 0.92 | 0.039 | 0.01 |
| 519 | 0.006 | 0.02 | 0.008 | 0.96 | 0.007 |
| 520 | 0.006 | 0.014 | 0.009 | 0.957 | 0.014 |
| 521 | 0.008 | 0.008 | 0.957 | 0.015 | 0.012 |
| 522 | 0.004 | 0.012 | 0.921 | 0.052 | 0.011 |
| 523 | 0.006 | 0.01 | 0.018 | 0.926 | 0.04 |
| 524 | 0.005 | 0.008 | 0.086 | 0.895 | 0.006 |
| 525 | 0.01 | 0.037 | 0.166 | 0.76 | 0.027 |
| 526 | 0.011 | 0.088 | 0.039 | 0.852 | 0.01 |
| 527 | 0.013 | 0.016 | 0.017 | 0.9 | 0.054 |
| 528 | 0.004 | 0.009 | 0.014 | 0.969 | 0.004 |
| 529 | 0.018 | 0.03 | 0.137 | 0.701 | 0.114 |
| 530 | 0.015 | 0.047 | 0.241 | 0.686 | 0.011 |
| 531 | 0.005 | 0.981 | 0.004 | 0.007 | 0.004 |
| 532 | 0.049 | 0.028 | 0.077 | 0.013 | 0.834 |
| 533 | 0.02 | 0.022 | 0.018 | 0.033 | 0.906 |
| 534 | 0.01 | 0.031 | 0.677 | 0.045 | 0.238 |
| 535 | 0.007 | 0.057 | 0.073 | 0.857 | 0.006 |
| 536 | 0.006 | 0.008 | 0.48 | 0.336 | 0.169 |
| 537 | 0.005 | 0.016 | 0.65 | 0.313 | 0.015 |
| 538 | 0.005 | 0.01 | 0.014 | 0.923 | 0.047 |
| 539 | 0.099 | 0.203 | 0.05 | 0.595 | 0.053 |
| 540 | 0.02 | 0.036 | 0.024 | 0.912 | 0.009 |
| 541 | 0.058 | 0.053 | 0.445 | 0.431 | 0.014 |
| 542 | 0.05 | 0.01 | 0.201 | 0.699 | 0.041 |
| 543 | 0.023 | 0.031 | 0.018 | 0.908 | 0.02 |
| 544 | 0.004 | 0.008 | 0.254 | 0.719 | 0.016 |
| 545 | 0.019 | 0.043 | 0.03 | 0.88 | 0.028 |
| 546 | 0.022 | 0.13 | 0.088 | 0.299 | 0.461 |
| 547 | 0.006 | 0.064 | 0.014 | 0.034 | 0.882 |
| 548 | 0.017 | 0.014 | 0.008 | 0.007 | 0.953 |
| 549 | 0.006 | 0.016 | 0.108 | 0.089 | 0.781 |
| 550 | 0.009 | 0.009 | 0.007 | 0.021 | 0.953 |
| 551 | 0.005 | 0.012 | 0.017 | 0.463 | 0.503 |
| 552 | 0.008 | 0.015 | 0.014 | 0.014 | 0.949 |
| 553 | 0.01 | 0.619 | 0.134 | 0.214 | 0.024 |
| 554 | 0.019 | 0.164 | 0.274 | 0.393 | 0.15 |
| 555 | 0.029 | 0.374 | 0.016 | 0.238 | 0.344 |
| 556 | 0.006 | 0.018 | 0.008 | 0.013 | 0.955 |
| 557 | 0.012 | 0.207 | 0.041 | 0.056 | 0.685 |
| 558 | 0.005 | 0.93 | 0.037 | 0.019 | 0.009 |
| 559 | 0.026 | 0.008 | 0.023 | 0.098 | 0.845 |
| 560 | 0.02 | 0.886 | 0.012 | 0.015 | 0.067 |
| 561 | 0.003 | 0.082 | 0.009 | 0.009 | 0.897 |
| 562 | 0.008 | 0.339 | 0.048 | 0.15 | 0.456 |
| 563 | 0.004 | 0.004 | 0.006 | 0.007 | 0.979 |
| 564 | 0.018 | 0.013 | 0.009 | 0.014 | 0.947 |
| 565 | 0.006 | 0.034 | 0.02 | 0.865 | 0.075 |
| 566 | 0.029 | 0.012 | 0.005 | 0.012 | 0.942 |
| 567 | 0.008 | 0.02 | 0.107 | 0.05 | 0.815 |
| 568 | 0.02 | 0.022 | 0.019 | 0.033 | 0.906 |
| 569 | 0.05 | 0.028 | 0.079 | 0.013 | 0.831 |
| 570 | 0.225 | 0.007 | 0.009 | 0.022 | 0.737 |
| 571 | 0.006 | 0.011 | 0.004 | 0.01 | 0.969 |
| 572 | 0.069 | 0.029 | 0.009 | 0.023 | 0.871 |
| 573 | 0.017 | 0.111 | 0.03 | 0.025 | 0.817 |
| 574 | 0.01 | 0.008 | 0.006 | 0.022 | 0.954 |
| 575 | 0.006 | 0.02 | 0.012 | 0.012 | 0.949 |
| 576 | 0.009 | 0.019 | 0.034 | 0.083 | 0.855 |
| 577 | 0.028 | 0.017 | 0.11 | 0.01 | 0.835 |
| 578 | 0.004 | 0.007 | 0.017 | 0.019 | 0.953 |
| 579 | 0.011 | 0.046 | 0.007 | 0.019 | 0.917 |
| 580 | 0.072 | 0.012 | 0.011 | 0.1 | 0.804 |
| 581 | 0.008 | 0.009 | 0.006 | 0.006 | 0.971 |
| 582 | 0.006 | 0.016 | 0.01 | 0.009 | 0.959 |
| 583 | 0.042 | 0.021 | 0.022 | 0.095 | 0.82 |
| 584 | 0.021 | 0.073 | 0.149 | 0.27 | 0.486 |
| 585 | 0.041 | 0.026 | 0.029 | 0.018 | 0.886 |
| 586 | 0.008 | 0.009 | 0.005 | 0.011 | 0.967 |
| 587 | 0.011 | 0.015 | 0.015 | 0.707 | 0.253 |
| 588 | 0.004 | 0.009 | 0.01 | 0.027 | 0.95 |
| 589 | 0.079 | 0.036 | 0.016 | 0.202 | 0.666 |
| 590 | 0.007 | 0.007 | 0.017 | 0.012 | 0.958 |
| 591 | 0.028 | 0.049 | 0.135 | 0.165 | 0.623 |
| 592 | 0.006 | 0.019 | 0.128 | 0.013 | 0.835 |
| 593 | 0.006 | 0.005 | 0.01 | 0.02 | 0.959 |
| 594 | 0.012 | 0.84 | 0.034 | 0.027 | 0.086 |
| 595 | 0.006 | 0.013 | 0.008 | 0.013 | 0.96 |
| 596 | 0.017 | 0.034 | 0.015 | 0.011 | 0.924 |
| 597 | 0.003 | 0.005 | 0.008 | 0.057 | 0.927 |
| 598 | 0.013 | 0.006 | 0.01 | 0.013 | 0.959 |
| 599 | 0.014 | 0.013 | 0.01 | 0.011 | 0.952 |
| 600 | 0.008 | 0.005 | 0.014 | 0.037 | 0.937 |
| 601 | 0.012 | 0.341 | 0.014 | 0.05 | 0.582 |
| 602 | 0.009 | 0.008 | 0.016 | 0.013 | 0.953 |
| 603 | 0.013 | 0.01 | 0.011 | 0.096 | 0.871 |
| 604 | 0.014 | 0.011 | 0.015 | 0.06 | 0.901 |
| 605 | 0.006 | 0.006 | 0.008 | 0.009 | 0.972 |
| 606 | 0.033 | 0.017 | 0.023 | 0.03 | 0.897 |
| 607 | 0.005 | 0.007 | 0.005 | 0.005 | 0.978 |
| 608 | 0.006 | 0.009 | 0.007 | 0.008 | 0.97 |
| 609 | 0.004 | 0.005 | 0.006 | 0.005 | 0.98 |
| 610 | 0.007 | 0.004 | 0.005 | 0.007 | 0.976 |
| 611 | 0.01 | 0.009 | 0.017 | 0.026 | 0.938 |
| 612 | 0.005 | 0.006 | 0.007 | 0.009 | 0.974 |
| 613 | 0.006 | 0.006 | 0.012 | 0.007 | 0.969 |
| 614 | 0.017 | 0.007 | 0.014 | 0.013 | 0.948 |
| 615 | 0.003 | 0.004 | 0.007 | 0.014 | 0.971 |
| 616 | 0.05 | 0.026 | 0.014 | 0.025 | 0.884 |
| 617 | 0.005 | 0.004 | 0.018 | 0.009 | 0.964 |
| 618 | 0.004 | 0.007 | 0.008 | 0.022 | 0.959 |
| 619 | 0.004 | 0.016 | 0.008 | 0.045 | 0.927 |
| 620 | 0.201 | 0.042 | 0.013 | 0.065 | 0.678 |
| 621 | 0.004 | 0.005 | 0.007 | 0.007 | 0.977 |
| 622 | 0.011 | 0.011 | 0.013 | 0.01 | 0.955 |
| 623 | 0.021 | 0.028 | 0.024 | 0.019 | 0.909 |
| 624 | 0.024 | 0.031 | 0.01 | 0.783 | 0.153 |
| 625 | 0.038 | 0.025 | 0.046 | 0.422 | 0.47 |
| 626 | 0.007 | 0.007 | 0.014 | 0.009 | 0.963 |
| 627 | 0.065 | 0.021 | 0.008 | 0.012 | 0.894 |
| 628 | 0.005 | 0.006 | 0.01 | 0.009 | 0.969 |
| 629 | 0.021 | 0.276 | 0.018 | 0.153 | 0.532 |
| 630 | 0.003 | 0.006 | 0.011 | 0.009 | 0.971 |
| 631 | 0.006 | 0.004 | 0.006 | 0.007 | 0.977 |
| 632 | 0.007 | 0.021 | 0.012 | 0.029 | 0.93 |
| 633 | 0.003 | 0.005 | 0.006 | 0.007 | 0.978 |
| 634 | 0.004 | 0.006 | 0.008 | 0.012 | 0.97 |
| 635 | 0.01 | 0.005 | 0.006 | 0.007 | 0.972 |
| 636 | 0.005 | 0.007 | 0.007 | 0.008 | 0.973 |
| 637 | 0.016 | 0.021 | 0.093 | 0.048 | 0.823 |
| 638 | 0.005 | 0.006 | 0.006 | 0.013 | 0.97 |
| 639 | 0.005 | 0.007 | 0.012 | 0.013 | 0.963 |
| 640 | 0.019 | 0.024 | 0.012 | 0.092 | 0.853 |
| 641 | 0.006 | 0.016 | 0.018 | 0.032 | 0.929 |
| 642 | 0.004 | 0.006 | 0.006 | 0.007 | 0.977 |
| 643 | 0.009 | 0.01 | 0.017 | 0.028 | 0.936 |
| 644 | 0.005 | 0.017 | 0.009 | 0.014 | 0.956 |
| 645 | 0.021 | 0.016 | 0.016 | 0.209 | 0.738 |
| 646 | 0.005 | 0.012 | 0.031 | 0.012 | 0.94 |
| 647 | 0.014 | 0.807 | 0.13 | 0.021 | 0.028 |
| 648 | 0.007 | 0.004 | 0.006 | 0.008 | 0.975 |
| 649 | 0.005 | 0.014 | 0.023 | 0.012 | 0.946 |
| 650 | 0.005 | 0.005 | 0.012 | 0.009 | 0.97 |
| 651 | 0.01 | 0.007 | 0.011 | 0.01 | 0.963 |
| 652 | 0.003 | 0.006 | 0.061 | 0.02 | 0.91 |
| 653 | 0.01 | 0.01 | 0.007 | 0.02 | 0.952 |
| 654 | 0.007 | 0.023 | 0.042 | 0.266 | 0.662 |
| 655 | 0.02 | 0.005 | 0.007 | 0.008 | 0.96 |
| 656 | 0.012 | 0.006 | 0.008 | 0.009 | 0.965 |
| 657 | 0.058 | 0.01 | 0.014 | 0.031 | 0.888 |
| 658 | 0.006 | 0.007 | 0.048 | 0.019 | 0.92 |
| 659 | 0.005 | 0.007 | 0.013 | 0.008 | 0.967 |
| 660 | 0.004 | 0.009 | 0.011 | 0.015 | 0.961 |
| 661 | 0.017 | 0.009 | 0.064 | 0.533 | 0.376 |
| 662 | 0.009 | 0.016 | 0.017 | 0.028 | 0.929 |
| 663 | 0.02 | 0.012 | 0.019 | 0.012 | 0.936 |
| 664 | 0.024 | 0.015 | 0.05 | 0.041 | 0.869 |
| 665 | 0.045 | 0.023 | 0.009 | 0.03 | 0.894 |
| 666 | 0.035 | 0.02 | 0.163 | 0.031 | 0.751 |
| 667 | 0.011 | 0.012 | 0.01 | 0.097 | 0.871 |
| 668 | 0.01 | 0.006 | 0.008 | 0.011 | 0.964 |
| 669 | 0.007 | 0.05 | 0.056 | 0.178 | 0.709 |
| 670 | 0.045 | 0.022 | 0.009 | 0.031 | 0.893 |
| 671 | 0.009 | 0.01 | 0.131 | 0.016 | 0.834 |
| 672 | 0.007 | 0.008 | 0.011 | 0.026 | 0.949 |
| 673 | 0.011 | 0.018 | 0.046 | 0.12 | 0.805 |
| 674 | 0.019 | 0.061 | 0.207 | 0.088 | 0.624 |
| 675 | 0.006 | 0.013 | 0.007 | 0.044 | 0.931 |
| 676 | 0.012 | 0.021 | 0.021 | 0.017 | 0.929 |
| 677 | 0.083 | 0.8 | 0.017 | 0.084 | 0.016 |
| 678 | 0.004 | 0.046 | 0.093 | 0.074 | 0.784 |
| 679 | 0.011 | 0.063 | 0.063 | 0.1 | 0.762 |
| 680 | 0.031 | 0.008 | 0.025 | 0.013 | 0.922 |
| 681 | 0.005 | 0.015 | 0.01 | 0.015 | 0.956 |
| 682 | 0.013 | 0.048 | 0.023 | 0.013 | 0.903 |
| 683 | 0.058 | 0.09 | 0.077 | 0.026 | 0.75 |
| 684 | 0.003 | 0.004 | 0.004 | 0.013 | 0.977 |
| 685 | 0.254 | 0.006 | 0.014 | 0.028 | 0.697 |
| 686 | 0.004 | 0.004 | 0.021 | 0.007 | 0.964 |
| 687 | 0.018 | 0.015 | 0.018 | 0.007 | 0.942 |
| 688 | 0.026 | 0.018 | 0.022 | 0.134 | 0.801 |
| 689 | 0.006 | 0.009 | 0.086 | 0.282 | 0.617 |
| 690 | 0.006 | 0.008 | 0.005 | 0.006 | 0.975 |
| 691 | 0.004 | 0.005 | 0.014 | 0.011 | 0.966 |
| 692 | 0.049 | 0.023 | 0.009 | 0.021 | 0.897 |
| 693 | 0.003 | 0.004 | 0.006 | 0.01 | 0.977 |
| 694 | 0.059 | 0.028 | 0.044 | 0.033 | 0.835 |
| 695 | 0.006 | 0.007 | 0.007 | 0.007 | 0.972 |
| 696 | 0.005 | 0.007 | 0.005 | 0.014 | 0.97 |
| 697 | 0.007 | 0.011 | 0.007 | 0.074 | 0.901 |
| 698 | 0.013 | 0.028 | 0.05 | 0.811 | 0.1 |
| 699 | 0.017 | 0.007 | 0.005 | 0.005 | 0.966 |
| 700 | 0.009 | 0.008 | 0.046 | 0.029 | 0.908 |
| 701 | 0.019 | 0.04 | 0.012 | 0.017 | 0.913 |
| 702 | 0.051 | 0.01 | 0.005 | 0.021 | 0.913 |
| 703 | 0.019 | 0.051 | 0.007 | 0.005 | 0.918 |
| 704 | 0.038 | 0.02 | 0.035 | 0.088 | 0.819 |
| 705 | 0.004 | 0.004 | 0.007 | 0.007 | 0.979 |
| 706 | 0.004 | 0.003 | 0.007 | 0.01 | 0.976 |
| 707 | 0.003 | 0.004 | 0.008 | 0.007 | 0.979 |
| 708 | 0.005 | 0.007 | 0.014 | 0.016 | 0.958 |
| 709 | 0.005 | 0.004 | 0.007 | 0.005 | 0.979 |
| 710 | 0.005 | 0.01 | 0.013 | 0.035 | 0.936 |
| 711 | 0.006 | 0.005 | 0.009 | 0.014 | 0.966 |
| 712 | 0.004 | 0.099 | 0.383 | 0.146 | 0.368 |
| 713 | 0.041 | 0.035 | 0.011 | 0.012 | 0.901 |
| 714 | 0.02 | 0.005 | 0.008 | 0.013 | 0.955 |
| 715 | 0.004 | 0.004 | 0.005 | 0.005 | 0.982 |
| 716 | 0.024 | 0.13 | 0.055 | 0.114 | 0.677 |
| 717 | 0.019 | 0.011 | 0.053 | 0.036 | 0.88 |
| 718 | 0.009 | 0.015 | 0.024 | 0.013 | 0.939 |
| 719 | 0.01 | 0.008 | 0.014 | 0.153 | 0.816 |
| 720 | 0.008 | 0.025 | 0.043 | 0.081 | 0.843 |
| 721 | 0.021 | 0.008 | 0.009 | 0.006 | 0.956 |
| 722 | 0.019 | 0.007 | 0.008 | 0.008 | 0.959 |
| 723 | 0.008 | 0.008 | 0.011 | 0.022 | 0.952 |
| 724 | 0.003 | 0.006 | 0.007 | 0.012 | 0.973 |
| 725 | 0.009 | 0.15 | 0.017 | 0.097 | 0.727 |
| 726 | 0.01 | 0.006 | 0.01 | 0.034 | 0.941 |
| 727 | 0.087 | 0.025 | 0.041 | 0.02 | 0.827 |
| 728 | 0.004 | 0.012 | 0.024 | 0.019 | 0.941 |
| 729 | 0.019 | 0.014 | 0.017 | 0.111 | 0.838 |
| 730 | 0.007 | 0.036 | 0.018 | 0.361 | 0.578 |
| 731 | 0.01 | 0.013 | 0.006 | 0.024 | 0.947 |
| 732 | 0.007 | 0.009 | 0.01 | 0.011 | 0.965 |
| 733 | 0.006 | 0.009 | 0.006 | 0.015 | 0.965 |
| 734 | 0.078 | 0.446 | 0.113 | 0.12 | 0.243 |
| 735 | 0.005 | 0.952 | 0.021 | 0.018 | 0.004 |
| 736 | 0.007 | 0.009 | 0.007 | 0.007 | 0.971 |
| 737 | 0.008 | 0.971 | 0.007 | 0.01 | 0.004 |
| 738 | 0.013 | 0.093 | 0.013 | 0.07 | 0.811 |
| 739 | 0.012 | 0.154 | 0.069 | 0.499 | 0.265 |
| 740 | 0.013 | 0.04 | 0.064 | 0.82 | 0.062 |
| 741 | 0.02 | 0.009 | 0.016 | 0.014 | 0.942 |
| 742 | 0.015 | 0.899 | 0.022 | 0.033 | 0.03 |
| 743 | 0.008 | 0.353 | 0.02 | 0.185 | 0.433 |
| 744 | 0.006 | 0.046 | 0.013 | 0.9 | 0.035 |
| 745 | 0.01 | 0.487 | 0.128 | 0.141 | 0.233 |
| 746 | 0.025 | 0.588 | 0.021 | 0.108 | 0.258 |
| 747 | 0.009 | 0.021 | 0.107 | 0.567 | 0.296 |
| 748 | 0.057 | 0.006 | 0.009 | 0.014 | 0.914 |
| 749 | 0.003 | 0.003 | 0.004 | 0.006 | 0.984 |
| 750 | 0.015 | 0.685 | 0.013 | 0.093 | 0.194 |
| 751 | 0.026 | 0.021 | 0.009 | 0.02 | 0.924 |
| 752 | 0.004 | 0.005 | 0.009 | 0.012 | 0.971 |
| 753 | 0.007 | 0.963 | 0.014 | 0.009 | 0.006 |
| 754 | 0.005 | 0.005 | 0.019 | 0.015 | 0.957 |
| 755 | 0.023 | 0.021 | 0.025 | 0.032 | 0.9 |
| 756 | 0.011 | 0.034 | 0.019 | 0.011 | 0.925 |
| 757 | 0.018 | 0.015 | 0.202 | 0.182 | 0.583 |
| 758 | 0.012 | 0.016 | 0.016 | 0.008 | 0.947 |
| 759 | 0.009 | 0.009 | 0.006 | 0.049 | 0.926 |
| 760 | 0.027 | 0.228 | 0.025 | 0.009 | 0.711 |
| 761 | 0.044 | 0.009 | 0.055 | 0.027 | 0.865 |
| 762 | 0.028 | 0.09 | 0.215 | 0.026 | 0.641 |
| 763 | 0.006 | 0.005 | 0.01 | 0.007 | 0.971 |
| 764 | 0.033 | 0.008 | 0.014 | 0.311 | 0.635 |
| 765 | 0.007 | 0.008 | 0.009 | 0.006 | 0.97 |
| 766 | 0.073 | 0.099 | 0.016 | 0.037 | 0.775 |
| 767 | 0.01 | 0.007 | 0.023 | 0.045 | 0.914 |
| 768 | 0.008 | 0.027 | 0.085 | 0.024 | 0.856 |
| 769 | 0.01 | 0.041 | 0.109 | 0.135 | 0.705 |
| 770 | 0.048 | 0.082 | 0.039 | 0.085 | 0.746 |
| 771 | 0.008 | 0.007 | 0.007 | 0.019 | 0.96 |
| 772 | 0.043 | 0.066 | 0.023 | 0.044 | 0.824 |
| 773 | 0.008 | 0.018 | 0.053 | 0.052 | 0.869 |
| 774 | 0.005 | 0.008 | 0.013 | 0.02 | 0.954 |
| 775 | 0.023 | 0.019 | 0.005 | 0.011 | 0.942 |
| 776 | 0.013 | 0.028 | 0.015 | 0.039 | 0.905 |
| 777 | 0.038 | 0.089 | 0.007 | 0.026 | 0.84 |
| 778 | 0.01 | 0.008 | 0.029 | 0.066 | 0.886 |
| 779 | 0.024 | 0.016 | 0.032 | 0.199 | 0.729 |
| 780 | 0.031 | 0.01 | 0.005 | 0.02 | 0.934 |
| 781 | 0.02 | 0.665 | 0.056 | 0.122 | 0.138 |
| 782 | 0.027 | 0.359 | 0.243 | 0.06 | 0.311 |
| 783 | 0.01 | 0.013 | 0.007 | 0.008 | 0.961 |
| 784 | 0.062 | 0.018 | 0.029 | 0.142 | 0.749 |
| 785 | 0.012 | 0.228 | 0.109 | 0.016 | 0.635 |
| 786 | 0.025 | 0.603 | 0.067 | 0.047 | 0.258 |
| 787 | 0.063 | 0.008 | 0.012 | 0.008 | 0.909 |
| 788 | 0.011 | 0.37 | 0.018 | 0.078 | 0.523 |
| 789 | 0.021 | 0.009 | 0.019 | 0.036 | 0.916 |
| 790 | 0.07 | 0.022 | 0.006 | 0.01 | 0.891 |
| 791 | 0.034 | 0.237 | 0.011 | 0.028 | 0.69 |
| 792 | 0.004 | 0.01 | 0.012 | 0.01 | 0.965 |
| 793 | 0.011 | 0.008 | 0.015 | 0.109 | 0.857 |
| 794 | 0.034 | 0.039 | 0.013 | 0.524 | 0.389 |
| 795 | 0.01 | 0.04 | 0.015 | 0.033 | 0.902 |
| 796 | 0.021 | 0.553 | 0.018 | 0.031 | 0.377 |
| 797 | 0.03 | 0.006 | 0.009 | 0.021 | 0.933 |
| 798 | 0.005 | 0.007 | 0.008 | 0.02 | 0.96 |
| 799 | 0.011 | 0.327 | 0.023 | 0.041 | 0.598 |
| 800 | 0.024 | 0.063 | 0.009 | 0.028 | 0.876 |
| 801 | 0.008 | 0.011 | 0.036 | 0.285 | 0.661 |
| 802 | 0.005 | 0.757 | 0.019 | 0.019 | 0.2 |
| 803 | 0.007 | 0.006 | 0.006 | 0.02 | 0.961 |
| 804 | 0.011 | 0.193 | 0.012 | 0.071 | 0.713 |
| 805 | 0.01 | 0.01 | 0.01 | 0.063 | 0.908 |
| 806 | 0.005 | 0.026 | 0.035 | 0.036 | 0.898 |
| 807 | 0.011 | 0.012 | 0.231 | 0.077 | 0.668 |
| 808 | 0.008 | 0.007 | 0.012 | 0.01 | 0.963 |
| 809 | 0.01 | 0.036 | 0.033 | 0.093 | 0.828 |
| 810 | 0.046 | 0.124 | 0.132 | 0.33 | 0.368 |
| 811 | 0.055 | 0.104 | 0.016 | 0.01 | 0.815 |
| 812 | 0.005 | 0.008 | 0.009 | 0.007 | 0.971 |
| 813 | 0.007 | 0.013 | 0.039 | 0.13 | 0.81 |
| 814 | 0.008 | 0.11 | 0.041 | 0.094 | 0.746 |
| 815 | 0.016 | 0.075 | 0.016 | 0.103 | 0.79 |
| 816 | 0.01 | 0.016 | 0.011 | 0.018 | 0.944 |
| 817 | 0.025 | 0.931 | 0.017 | 0.018 | 0.009 |
| 818 | 0.012 | 0.045 | 0.028 | 0.02 | 0.896 |
| 819 | 0.007 | 0.886 | 0.01 | 0.07 | 0.026 |
| 820 | 0.004 | 0.012 | 0.023 | 0.013 | 0.949 |
| 821 | 0.008 | 0.012 | 0.032 | 0.499 | 0.449 |
| 822 | 0.044 | 0.011 | 0.008 | 0.035 | 0.902 |
| 823 | 0.01 | 0.191 | 0.026 | 0.039 | 0.735 |
| 824 | 0.01 | 0.08 | 0.047 | 0.049 | 0.813 |
| 825 | 0.057 | 0.005 | 0.015 | 0.008 | 0.915 |
| 826 | 0.007 | 0.012 | 0.02 | 0.052 | 0.91 |
| 827 | 0.017 | 0.51 | 0.019 | 0.014 | 0.44 |
| 828 | 0.006 | 0.011 | 0.012 | 0.747 | 0.225 |
| 829 | 0.077 | 0.111 | 0.01 | 0.03 | 0.772 |
| 830 | 0.008 | 0.007 | 0.161 | 0.025 | 0.799 |
| 831 | 0.007 | 0.04 | 0.007 | 0.051 | 0.895 |
| 832 | 0.02 | 0.219 | 0.008 | 0.392 | 0.361 |
| 833 | 0.02 | 0.003 | 0.005 | 0.007 | 0.965 |
| 834 | 0.017 | 0.016 | 0.071 | 0.017 | 0.879 |
| 835 | 0.005 | 0.026 | 0.019 | 0.277 | 0.673 |
| 836 | 0.003 | 0.02 | 0.074 | 0.005 | 0.898 |
| 837 | 0.008 | 0.007 | 0.007 | 0.004 | 0.974 |
| 838 | 0.006 | 0.005 | 0.005 | 0.005 | 0.979 |
| 839 | 0.007 | 0.006 | 0.007 | 0.012 | 0.968 |
| 840 | 0.017 | 0.009 | 0.03 | 0.007 | 0.937 |
| 841 | 0.006 | 0.007 | 0.007 | 0.022 | 0.958 |
| 842 | 0.006 | 0.009 | 0.018 | 0.014 | 0.954 |
| 843 | 0.006 | 0.027 | 0.084 | 0.03 | 0.853 |
| 844 | 0.007 | 0.006 | 0.004 | 0.01 | 0.972 |
| 845 | 0.008 | 0.011 | 0.006 | 0.011 | 0.965 |
| 846 | 0.016 | 0.007 | 0.009 | 0.014 | 0.954 |
| 847 | 0.045 | 0.019 | 0.02 | 0.008 | 0.907 |
| 848 | 0.046 | 0.045 | 0.026 | 0.024 | 0.859 |
| 849 | 0.005 | 0.005 | 0.007 | 0.014 | 0.97 |
| 850 | 0.006 | 0.006 | 0.006 | 0.008 | 0.974 |
| 851 | 0.006 | 0.005 | 0.006 | 0.018 | 0.964 |
| 852 | 0.031 | 0.033 | 0.051 | 0.063 | 0.822 |
| 853 | 0.027 | 0.009 | 0.024 | 0.036 | 0.904 |
| 854 | 0.005 | 0.007 | 0.006 | 0.009 | 0.973 |
| 855 | 0.016 | 0.017 | 0.008 | 0.009 | 0.95 |
| 856 | 0.023 | 0.062 | 0.009 | 0.018 | 0.888 |
| 857 | 0.013 | 0.038 | 0.021 | 0.013 | 0.915 |
| 858 | 0.01 | 0.014 | 0.007 | 0.007 | 0.962 |
| 859 | 0.005 | 0.007 | 0.007 | 0.006 | 0.976 |
| 860 | 0.013 | 0.006 | 0.007 | 0.007 | 0.967 |
| 861 | 0.006 | 0.023 | 0.007 | 0.01 | 0.954 |
| 862 | 0.011 | 0.009 | 0.006 | 0.006 | 0.968 |
| 863 | 0.008 | 0.955 | 0.022 | 0.008 | 0.007 |
| 864 | 0.021 | 0.757 | 0.174 | 0.042 | 0.007 |
| 865 | 0.006 | 0.917 | 0.011 | 0.056 | 0.01 |
| 866 | 0.005 | 0.962 | 0.006 | 0.023 | 0.004 |
| 867 | 0.016 | 0.918 | 0.037 | 0.016 | 0.014 |
| 868 | 0.101 | 0.881 | 0.005 | 0.006 | 0.007 |
| 869 | 0.012 | 0.97 | 0.005 | 0.008 | 0.005 |
| 870 | 0.012 | 0.97 | 0.005 | 0.008 | 0.005 |
| 871 | 0.011 | 0.956 | 0.017 | 0.011 | 0.005 |
| 872 | 0.006 | 0.962 | 0.015 | 0.011 | 0.006 |
| 873 | 0.009 | 0.938 | 0.008 | 0.04 | 0.006 |
| 874 | 0.007 | 0.929 | 0.01 | 0.012 | 0.042 |
| 875 | 0.01 | 0.956 | 0.014 | 0.013 | 0.007 |
| 876 | 0.007 | 0.961 | 0.013 | 0.015 | 0.005 |
| 877 | 0.008 | 0.954 | 0.011 | 0.014 | 0.013 |
| 878 | 0.375 | 0.495 | 0.059 | 0.061 | 0.009 |
| 879 | 0.008 | 0.846 | 0.078 | 0.044 | 0.024 |
| 880 | 0.008 | 0.956 | 0.017 | 0.014 | 0.006 |
| 881 | 0.028 | 0.899 | 0.056 | 0.008 | 0.009 |
| 882 | 0.021 | 0.945 | 0.008 | 0.013 | 0.013 |
| 883 | 0.016 | 0.947 | 0.01 | 0.017 | 0.011 |
| 884 | 0.012 | 0.955 | 0.01 | 0.014 | 0.01 |
| 885 | 0.014 | 0.955 | 0.014 | 0.011 | 0.006 |
| 886 | 0.005 | 0.981 | 0.006 | 0.005 | 0.003 |
| 887 | 0.003 | 0.005 | 0.98 | 0.007 | 0.006 |
| 888 | 0.004 | 0.006 | 0.981 | 0.006 | 0.004 |
| 889 | 0.004 | 0.007 | 0.969 | 0.013 | 0.006 |
| 890 | 0.006 | 0.782 | 0.197 | 0.007 | 0.007 |
| 891 | 0.062 | 0.809 | 0.014 | 0.064 | 0.052 |
| 892 | 0.04 | 0.057 | 0.792 | 0.016 | 0.096 |
| 893 | 0.008 | 0.154 | 0.442 | 0.371 | 0.024 |
| 894 | 0.004 | 0.014 | 0.966 | 0.007 | 0.009 |
| 895 | 0.004 | 0.006 | 0.977 | 0.007 | 0.007 |
| 896 | 0.003 | 0.005 | 0.981 | 0.007 | 0.005 |
| 897 | 0.003 | 0.004 | 0.984 | 0.004 | 0.005 |
| 898 | 0.003 | 0.004 | 0.983 | 0.005 | 0.004 |
| 899 | 0.008 | 0.496 | 0.381 | 0.067 | 0.047 |
| 900 | 0.014 | 0.037 | 0.924 | 0.01 | 0.014 |
| 901 | 0.045 | 0.039 | 0.036 | 0.87 | 0.009 |
| 902 | 0.26 | 0.418 | 0.03 | 0.258 | 0.034 |
| 903 | 0.093 | 0.745 | 0.02 | 0.117 | 0.025 |
| 904 | 0.003 | 0.004 | 0.984 | 0.005 | 0.004 |
| 905 | 0.022 | 0.163 | 0.162 | 0.129 | 0.524 |
| 906 | 0.027 | 0.098 | 0.784 | 0.067 | 0.024 |
| 907 | 0.007 | 0.887 | 0.073 | 0.023 | 0.01 |
| 908 | 0.002 | 0.004 | 0.985 | 0.005 | 0.003 |
| 909 | 0.006 | 0.008 | 0.943 | 0.034 | 0.008 |
| 910 | 0.003 | 0.004 | 0.983 | 0.005 | 0.005 |
| 911 | 0.009 | 0.782 | 0.17 | 0.033 | 0.006 |
| 912 | 0.137 | 0.532 | 0.239 | 0.047 | 0.046 |
| 913 | 0.009 | 0.933 | 0.019 | 0.015 | 0.024 |
| 914 | 0.01 | 0.922 | 0.011 | 0.042 | 0.015 |
| 915 | 0.031 | 0.929 | 0.011 | 0.016 | 0.013 |
| 916 | 0.01 | 0.912 | 0.04 | 0.024 | 0.014 |
| 917 | 0.008 | 0.911 | 0.047 | 0.021 | 0.013 |
| 918 | 0.012 | 0.943 | 0.008 | 0.028 | 0.009 |
| 919 | 0.014 | 0.93 | 0.013 | 0.032 | 0.012 |
| 920 | 0.025 | 0.96 | 0.006 | 0.005 | 0.004 |
| 921 | 0.021 | 0.924 | 0.021 | 0.015 | 0.018 |
| 922 | 0.01 | 0.316 | 0.323 | 0.33 | 0.022 |
| 923 | 0.11 | 0.864 | 0.015 | 0.006 | 0.005 |
| 924 | 0.008 | 0.913 | 0.028 | 0.02 | 0.032 |
| 925 | 0.018 | 0.853 | 0.032 | 0.09 | 0.007 |
| 926 | 0.018 | 0.853 | 0.066 | 0.033 | 0.031 |
| 927 | 0.021 | 0.016 | 0.01 | 0.935 | 0.018 |
| 928 | 0.01 | 0.927 | 0.035 | 0.022 | 0.006 |
| 929 | 0.005 | 0.94 | 0.034 | 0.016 | 0.006 |
| 930 | 0.044 | 0.939 | 0.006 | 0.006 | 0.006 |
| 931 | 0.012 | 0.837 | 0.053 | 0.045 | 0.053 |
| 932 | 0.136 | 0.827 | 0.02 | 0.013 | 0.004 |
| 933 | 0.005 | 0.67 | 0.02 | 0.067 | 0.239 |
| 934 | 0.025 | 0.938 | 0.023 | 0.008 | 0.006 |
| 935 | 0.13 | 0.06 | 0.198 | 0.228 | 0.383 |
| 936 | 0.019 | 0.013 | 0.018 | 0.027 | 0.923 |
| 937 | 0.005 | 0.005 | 0.004 | 0.006 | 0.979 |
| 938 | 0.018 | 0.104 | 0.114 | 0.028 | 0.736 |
| 939 | 0.006 | 0.041 | 0.023 | 0.064 | 0.865 |
| 940 | 0.008 | 0.014 | 0.045 | 0.033 | 0.9 |
| 941 | 0.008 | 0.006 | 0.005 | 0.005 | 0.976 |
| 942 | 0.066 | 0.012 | 0.022 | 0.775 | 0.125 |
| 943 | 0.016 | 0.188 | 0.014 | 0.051 | 0.731 |
| 944 | 0.019 | 0.017 | 0.008 | 0.035 | 0.922 |
| 945 | 0.042 | 0.868 | 0.027 | 0.055 | 0.008 |
| 946 | 0.011 | 0.026 | 0.018 | 0.043 | 0.902 |
| 947 | 0.017 | 0.127 | 0.528 | 0.11 | 0.218 |
| 948 | 0.005 | 0.972 | 0.01 | 0.007 | 0.006 |
| 949 | 0.005 | 0.921 | 0.054 | 0.012 | 0.008 |
| 950 | 0.009 | 0.283 | 0.025 | 0.096 | 0.587 |
| 951 | 0.009 | 0.005 | 0.007 | 0.016 | 0.963 |
| 952 | 0.006 | 0.037 | 0.014 | 0.017 | 0.926 |
| 953 | 0.009 | 0.397 | 0.48 | 0.062 | 0.052 |
| 954 | 0.01 | 0.03 | 0.018 | 0.022 | 0.919 |
| 955 | 0.006 | 0.028 | 0.016 | 0.01 | 0.939 |
| 956 | 0.044 | 0.017 | 0.007 | 0.016 | 0.916 |
| 957 | 0.009 | 0.007 | 0.011 | 0.01 | 0.963 |
| 958 | 0.007 | 0.021 | 0.016 | 0.029 | 0.927 |
| 959 | 0.004 | 0.005 | 0.014 | 0.012 | 0.966 |
| 960 | 0.008 | 0.009 | 0.015 | 0.006 | 0.962 |
| 961 | 0.025 | 0.012 | 0.015 | 0.011 | 0.938 |
| 962 | 0.008 | 0.006 | 0.022 | 0.007 | 0.956 |
| 963 | 0.012 | 0.008 | 0.283 | 0.031 | 0.666 |
| 964 | 0.015 | 0.008 | 0.011 | 0.009 | 0.957 |
| 965 | 0.012 | 0.006 | 0.024 | 0.021 | 0.937 |
| 966 | 0.004 | 0.003 | 0.023 | 0.004 | 0.965 |
| 967 | 0.009 | 0.005 | 0.581 | 0.018 | 0.386 |
| 968 | 0.022 | 0.006 | 0.032 | 0.011 | 0.929 |
| 969 | 0.122 | 0.05 | 0.044 | 0.015 | 0.769 |
| 970 | 0.01 | 0.005 | 0.011 | 0.008 | 0.967 |
| 971 | 0.004 | 0.009 | 0.011 | 0.008 | 0.968 |
| 972 | 0.015 | 0.025 | 0.297 | 0.009 | 0.653 |
| 973 | 0.008 | 0.007 | 0.277 | 0.019 | 0.688 |
| 974 | 0.009 | 0.008 | 0.045 | 0.006 | 0.933 |
| 975 | 0.014 | 0.01 | 0.029 | 0.01 | 0.938 |
| 976 | 0.004 | 0.007 | 0.009 | 0.005 | 0.975 |
| 977 | 0.035 | 0.004 | 0.013 | 0.004 | 0.945 |
| 978 | 0.074 | 0.033 | 0.028 | 0.013 | 0.852 |
| 979 | 0.005 | 0.006 | 0.018 | 0.008 | 0.963 |
| 980 | 0.007 | 0.005 | 0.321 | 0.013 | 0.655 |
| 981 | 0.007 | 0.004 | 0.005 | 0.004 | 0.98 |
| 982 | 0.04 | 0.01 | 0.013 | 0.009 | 0.928 |
| 983 | 0.016 | 0.009 | 0.014 | 0.009 | 0.951 |
| 984 | 0.008 | 0.005 | 0.017 | 0.011 | 0.959 |
| 985 | 0.007 | 0.006 | 0.027 | 0.008 | 0.952 |
| 986 | 0.022 | 0.005 | 0.054 | 0.005 | 0.914 |
| 987 | 0.004 | 0.011 | 0.674 | 0.007 | 0.303 |
| 988 | 0.013 | 0.005 | 0.067 | 0.008 | 0.908 |
| 989 | 0.016 | 0.01 | 0.02 | 0.007 | 0.947 |
| 990 | 0.009 | 0.034 | 0.087 | 0.026 | 0.844 |
| 991 | 0.005 | 0.007 | 0.764 | 0.015 | 0.211 |
| 992 | 0.011 | 0.013 | 0.828 | 0.013 | 0.135 |
| 993 | 0.005 | 0.006 | 0.032 | 0.022 | 0.935 |
| 994 | 0.009 | 0.004 | 0.025 | 0.008 | 0.954 |
| 995 | 0.016 | 0.014 | 0.098 | 0.023 | 0.85 |
| 996 | 0.012 | 0.006 | 0.02 | 0.008 | 0.955 |
| 997 | 0.006 | 0.004 | 0.023 | 0.007 | 0.959 |
| 998 | 0.013 | 0.008 | 0.217 | 0.022 | 0.74 |
| 999 | 0.006 | 0.005 | 0.008 | 0.009 | 0.971 |
| 1000 | 0.023 | 0.007 | 0.026 | 0.008 | 0.936 |
| 1001 | 0.005 | 0.006 | 0.023 | 0.013 | 0.952 |
| 1002 | 0.006 | 0.004 | 0.016 | 0.005 | 0.969 |
| 1003 | 0.005 | 0.007 | 0.021 | 0.007 | 0.959 |
| 1004 | 0.005 | 0.01 | 0.072 | 0.041 | 0.872 |
| 1005 | 0.01 | 0.004 | 0.006 | 0.008 | 0.972 |
| 1006 | 0.013 | 0.009 | 0.014 | 0.018 | 0.947 |
| 1007 | 0.008 | 0.004 | 0.021 | 0.007 | 0.96 |
| 1008 | 0.031 | 0.007 | 0.105 | 0.016 | 0.842 |
| 1009 | 0.006 | 0.006 | 0.014 | 0.013 | 0.961 |
| 1010 | 0.009 | 0.013 | 0.016 | 0.318 | 0.644 |
| 1011 | 0.007 | 0.009 | 0.007 | 0.011 | 0.967 |
| 1012 | 0.008 | 0.007 | 0.017 | 0.085 | 0.883 |
| 1013 | 0.01 | 0.01 | 0.046 | 0.025 | 0.909 |
| 1014 | 0.012 | 0.007 | 0.016 | 0.013 | 0.953 |
| 1015 | 0.009 | 0.008 | 0.175 | 0.527 | 0.28 |
| 1016 | 0.008 | 0.005 | 0.008 | 0.008 | 0.97 |
| 1017 | 0.007 | 0.004 | 0.037 | 0.011 | 0.942 |
| 1018 | 0.009 | 0.013 | 0.011 | 0.029 | 0.937 |
| 1019 | 0.014 | 0.014 | 0.031 | 0.07 | 0.871 |
| 1020 | 0.037 | 0.018 | 0.251 | 0.03 | 0.664 |
| 1021 | 0.015 | 0.015 | 0.103 | 0.051 | 0.816 |
| 1022 | 0.004 | 0.016 | 0.075 | 0.021 | 0.883 |
| 1023 | 0.007 | 0.012 | 0.02 | 0.01 | 0.95 |
| 1024 | 0.007 | 0.006 | 0.039 | 0.007 | 0.94 |
| 1025 | 0.004 | 0.021 | 0.041 | 0.019 | 0.914 |
| 1026 | 0.008 | 0.009 | 0.041 | 0.007 | 0.934 |